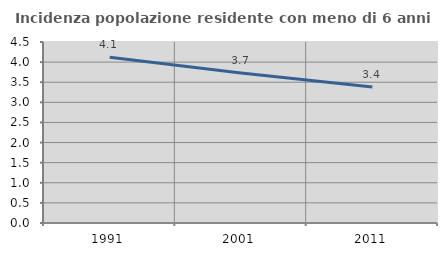
| Category | Incidenza popolazione residente con meno di 6 anni |
|---|---|
| 1991.0 | 4.122 |
| 2001.0 | 3.727 |
| 2011.0 | 3.378 |